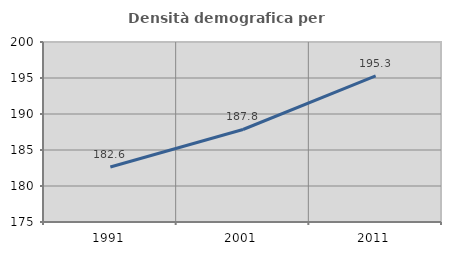
| Category | Densità demografica |
|---|---|
| 1991.0 | 182.641 |
| 2001.0 | 187.849 |
| 2011.0 | 195.307 |